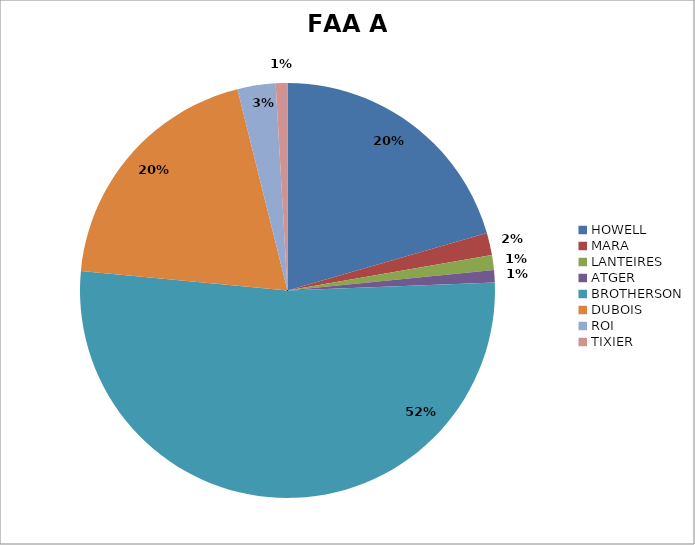
| Category | FAA A |
|---|---|
| HOWELL | 1329 |
| MARA | 112 |
| LANTEIRES | 74 |
| ATGER | 63 |
| BROTHERSON | 3372 |
| DUBOIS | 1269 |
| ROI | 192 |
| TIXIER | 59 |